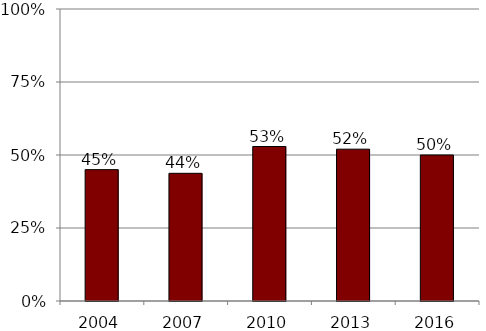
| Category | Series 0 |
|---|---|
| 2004.0 | 0.45 |
| 2007.0 | 0.437 |
| 2010.0 | 0.529 |
| 2013.0 | 0.52 |
| 2016.0 | 0.5 |